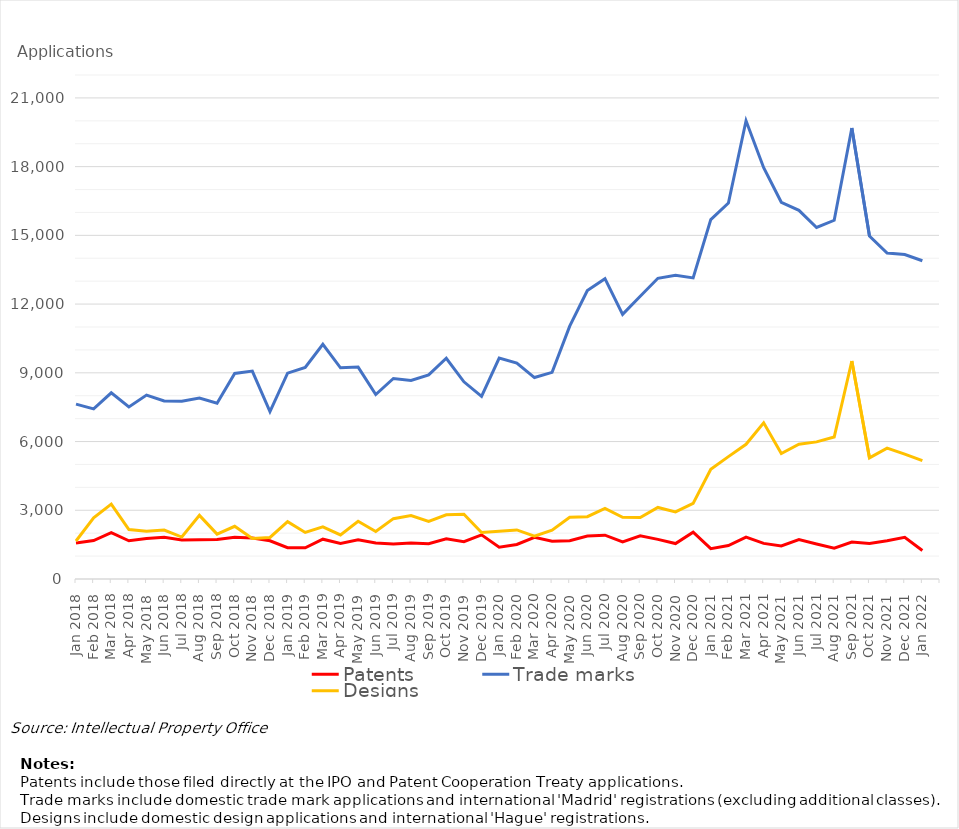
| Category | Patents | Trade marks | Designs |
|---|---|---|---|
| Jan 2018 | 1575 | 7634 | 1658 |
| Feb 2018 | 1676 | 7428 | 2672 |
| Mar 2018 | 2022 | 8127 | 3267 |
| Apr 2018 | 1670 | 7512 | 2160 |
| May 2018 | 1767 | 8030 | 2083 |
| Jun 2018 | 1821 | 7769 | 2136 |
| Jul 2018 | 1704 | 7757 | 1832 |
| Aug 2018 | 1713 | 7897 | 2777 |
| Sep 2018 | 1725 | 7673 | 1960 |
| Oct 2018 | 1818 | 8972 | 2302 |
| Nov 2018 | 1787 | 9076 | 1765 |
| Dec 2018 | 1670 | 7304 | 1815 |
| Jan 2019 | 1367 | 8985 | 2505 |
| Feb 2019 | 1361 | 9234 | 2031 |
| Mar 2019 | 1737 | 10243 | 2274 |
| Apr 2019 | 1552 | 9219 | 1923 |
| May 2019 | 1710 | 9251 | 2520 |
| Jun 2019 | 1569 | 8053 | 2074 |
| Jul 2019 | 1527 | 8752 | 2634 |
| Aug 2019 | 1571 | 8670 | 2768 |
| Sep 2019 | 1540 | 8907 | 2511 |
| Oct 2019 | 1755 | 9636 | 2800 |
| Nov 2019 | 1630 | 8607 | 2827 |
| Dec 2019 | 1926 | 7970 | 2028 |
| Jan 2020 | 1392 | 9642 | 2082 |
| Feb 2020 | 1506 | 9428 | 2143 |
| Mar 2020 | 1819 | 8794 | 1871 |
| Apr 2020 | 1648 | 9021 | 2127 |
| May 2020 | 1672 | 11035 | 2695 |
| Jun 2020 | 1880 | 12593 | 2721 |
| Jul 2020 | 1912 | 13110 | 3086 |
| Aug 2020 | 1616 | 11551 | 2694 |
| Sep 2020 | 1886 | 12340 | 2686 |
| Oct 2020 | 1731 | 13126 | 3124 |
| Nov 2020 | 1547 | 13254 | 2930 |
| Dec 2020 | 2043 | 13144 | 3302 |
| Jan 2021 | 1326 | 15685 | 4792 |
| Feb 2021 | 1463 | 16412 | 5341 |
| Mar 2021 | 1826 | 20001 | 5879 |
| Apr 2021 | 1554 | 17951 | 6815 |
| May 2021 | 1446 | 16446 | 5480 |
| Jun 2021 | 1717 | 16091 | 5882 |
| Jul 2021 | 1529 | 15345 | 5985 |
| Aug 2021 | 1348 | 15659 | 6199 |
| Sep 2021 | 1611 | 19685 | 9515 |
| Oct 2021 | 1546 | 14968 | 5289 |
| Nov 2021 | 1669 | 14229 | 5710 |
| Dec 2021 | 1818 | 14162 | 5450 |
| Jan 2022 | 1241 | 13891 | 5166 |